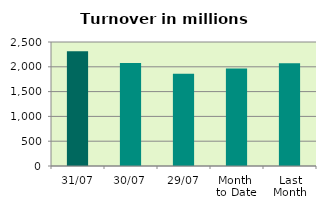
| Category | Series 0 |
|---|---|
| 31/07 | 2315.779 |
| 30/07 | 2074.787 |
| 29/07 | 1861.958 |
| Month 
to Date | 1965.856 |
| Last
Month | 2071.376 |